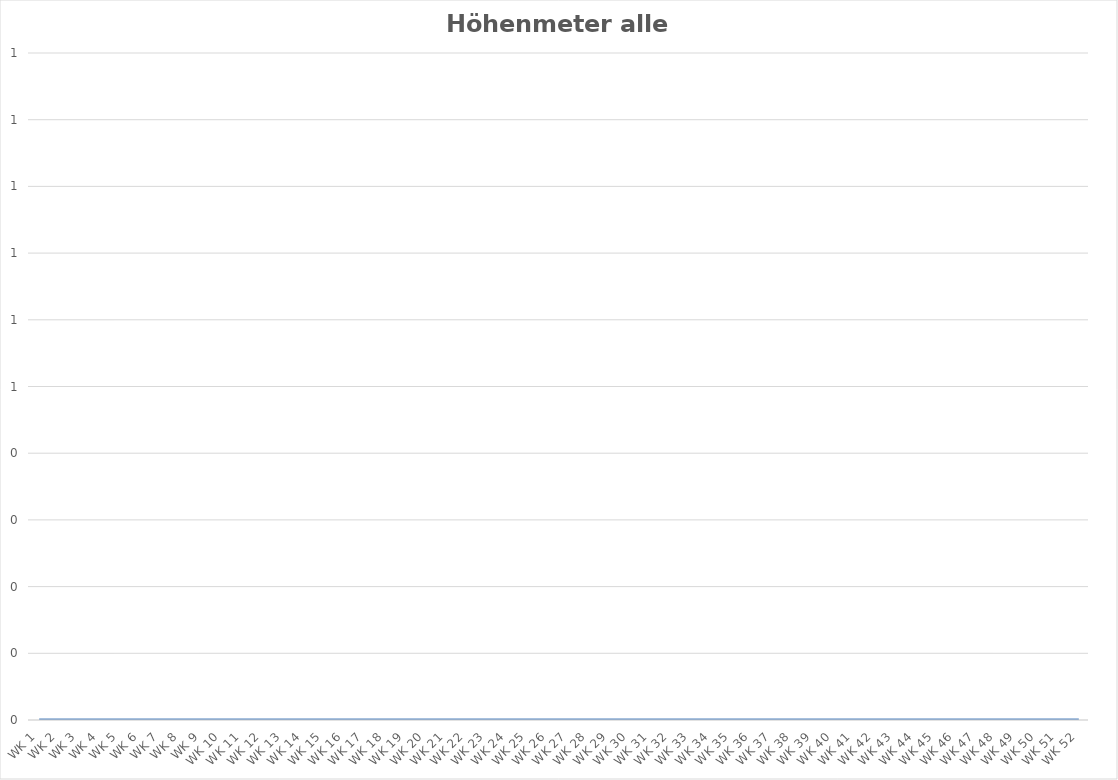
| Category | Höhenmeter Übersicht Total pro Woche alle Sportarten |
|---|---|
| WK 1 | 0 |
| WK 2 | 0 |
| WK 3 | 0 |
| WK 4 | 0 |
| WK 5 | 0 |
| WK 6 | 0 |
| WK 7 | 0 |
| WK 8 | 0 |
| WK 9 | 0 |
| WK 10 | 0 |
| WK 11 | 0 |
| WK 12 | 0 |
| WK 13 | 0 |
| WK 14 | 0 |
| WK 15 | 0 |
| WK 16 | 0 |
| WK 17 | 0 |
| WK 18 | 0 |
| WK 19 | 0 |
| WK 20 | 0 |
| WK 21 | 0 |
| WK 22 | 0 |
| WK 23 | 0 |
| WK 24 | 0 |
| WK 25 | 0 |
| WK 26 | 0 |
| WK 27 | 0 |
| WK 28 | 0 |
| WK 29 | 0 |
| WK 30 | 0 |
| WK 31 | 0 |
| WK 32 | 0 |
| WK 33 | 0 |
| WK 34 | 0 |
| WK 35 | 0 |
| WK 36 | 0 |
| WK 37 | 0 |
| WK 38 | 0 |
| WK 39 | 0 |
| WK 40 | 0 |
| WK 41 | 0 |
| WK 42 | 0 |
| WK 43 | 0 |
| WK 44 | 0 |
| WK 45 | 0 |
| WK 46 | 0 |
| WK 47 | 0 |
| WK 48 | 0 |
| WK 49 | 0 |
| WK 50 | 0 |
| WK 51 | 0 |
| WK 52 | 0 |